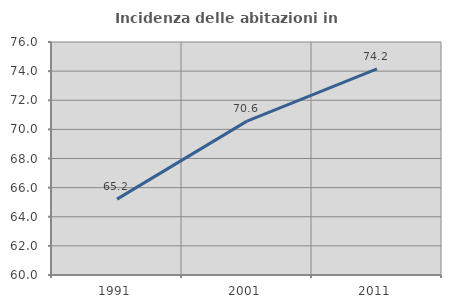
| Category | Incidenza delle abitazioni in proprietà  |
|---|---|
| 1991.0 | 65.21 |
| 2001.0 | 70.566 |
| 2011.0 | 74.158 |